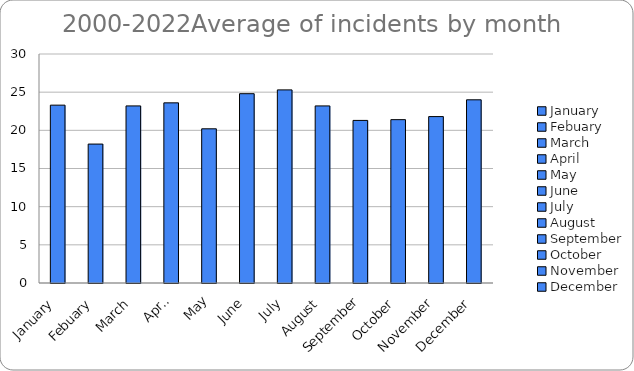
| Category | Series 0 |
|---|---|
| January | 23.3 |
| Febuary | 18.2 |
| March | 23.2 |
| April | 23.6 |
| May | 20.2 |
| June | 24.8 |
| July | 25.3 |
| August | 23.2 |
| September | 21.3 |
| October | 21.4 |
| November | 21.8 |
| December | 24 |